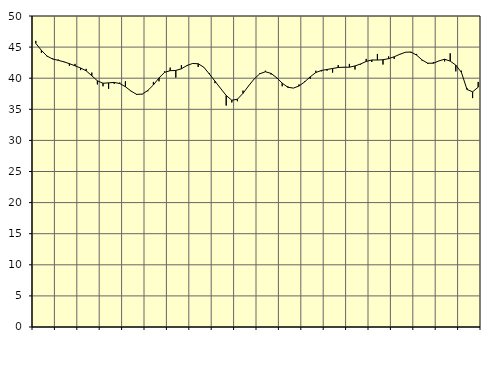
| Category | Piggar | Series 1 |
|---|---|---|
| nan | 46 | 45.6 |
| 1.0 | 44.1 | 44.48 |
| 1.0 | 43.5 | 43.56 |
| 1.0 | 43.2 | 43.08 |
| nan | 43 | 42.88 |
| 2.0 | 42.7 | 42.63 |
| 2.0 | 42 | 42.34 |
| 2.0 | 42.3 | 41.99 |
| nan | 41.3 | 41.64 |
| 3.0 | 41.5 | 41.19 |
| 3.0 | 40.9 | 40.39 |
| 3.0 | 39 | 39.58 |
| nan | 38.7 | 39.19 |
| 4.0 | 38.3 | 39.25 |
| 4.0 | 39.1 | 39.32 |
| 4.0 | 39.3 | 39.14 |
| nan | 39.5 | 38.63 |
| 5.0 | 37.9 | 37.93 |
| 5.0 | 37.3 | 37.4 |
| 5.0 | 37.4 | 37.44 |
| nan | 37.9 | 38.03 |
| 6.0 | 39.4 | 38.91 |
| 6.0 | 39.5 | 40.05 |
| 6.0 | 41.1 | 40.94 |
| nan | 41.7 | 41.21 |
| 7.0 | 40.1 | 41.25 |
| 7.0 | 42.1 | 41.51 |
| 7.0 | 42.1 | 42.04 |
| nan | 42.4 | 42.37 |
| 8.0 | 41.8 | 42.32 |
| 8.0 | 41.8 | 41.77 |
| 8.0 | 40.8 | 40.67 |
| nan | 39.2 | 39.52 |
| 9.0 | 38.4 | 38.36 |
| 9.0 | 35.6 | 37.22 |
| 9.0 | 36.1 | 36.46 |
| nan | 36.3 | 36.62 |
| 10.0 | 38 | 37.57 |
| 10.0 | 38.8 | 38.77 |
| 10.0 | 39.9 | 39.88 |
| nan | 40.8 | 40.71 |
| 11.0 | 41.2 | 41.04 |
| 11.0 | 40.6 | 40.77 |
| 11.0 | 40 | 40.09 |
| nan | 38.7 | 39.21 |
| 12.0 | 38.7 | 38.54 |
| 12.0 | 38.4 | 38.41 |
| 12.0 | 39 | 38.74 |
| nan | 39.5 | 39.4 |
| 13.0 | 39.9 | 40.22 |
| 13.0 | 41.2 | 40.91 |
| 13.0 | 41.1 | 41.25 |
| nan | 41.2 | 41.4 |
| 14.0 | 40.9 | 41.56 |
| 14.0 | 42.1 | 41.72 |
| 14.0 | 41.7 | 41.77 |
| nan | 42.3 | 41.77 |
| 15.0 | 41.4 | 41.97 |
| 15.0 | 42.2 | 42.29 |
| 15.0 | 43.1 | 42.69 |
| nan | 42.6 | 42.93 |
| 16.0 | 43.9 | 42.92 |
| 16.0 | 42.2 | 42.97 |
| 16.0 | 43.5 | 43.14 |
| nan | 43.1 | 43.45 |
| 17.0 | 43.9 | 43.84 |
| 17.0 | 44.2 | 44.17 |
| 17.0 | 44.1 | 44.21 |
| nan | 43.9 | 43.71 |
| 18.0 | 42.8 | 42.92 |
| 18.0 | 42.3 | 42.41 |
| 18.0 | 42.6 | 42.41 |
| nan | 42.8 | 42.78 |
| 19.0 | 42.7 | 43.05 |
| 19.0 | 44 | 42.75 |
| 19.0 | 41.1 | 42.1 |
| nan | 41.2 | 40.94 |
| 20.0 | 38.4 | 38.19 |
| 20.0 | 36.8 | 37.81 |
| 20.0 | 39.4 | 38.56 |